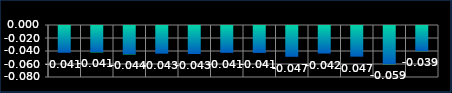
| Category | Series 0 |
|---|---|
| 0 | -0.041 |
| 1 | -0.041 |
| 2 | -0.044 |
| 3 | -0.043 |
| 4 | -0.043 |
| 5 | -0.041 |
| 6 | -0.041 |
| 7 | -0.047 |
| 8 | -0.042 |
| 9 | -0.047 |
| 10 | -0.059 |
| 11 | -0.039 |